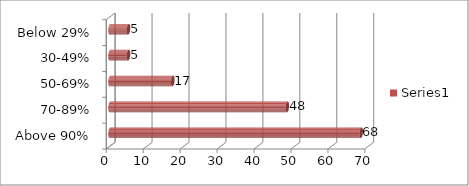
| Category | Series 0 |
|---|---|
| Above 90% | 68 |
| 70-89% | 48 |
| 50-69% | 17 |
| 30-49% | 5 |
| Below 29% | 5 |